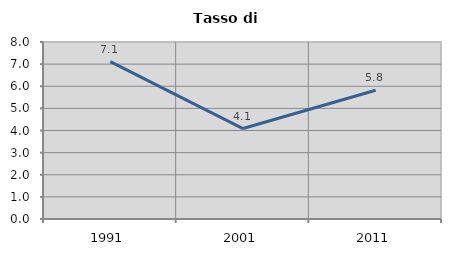
| Category | Tasso di disoccupazione   |
|---|---|
| 1991.0 | 7.116 |
| 2001.0 | 4.088 |
| 2011.0 | 5.818 |